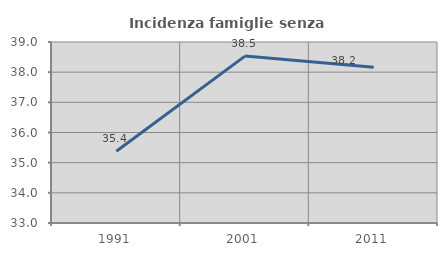
| Category | Incidenza famiglie senza nuclei |
|---|---|
| 1991.0 | 35.377 |
| 2001.0 | 38.533 |
| 2011.0 | 38.162 |